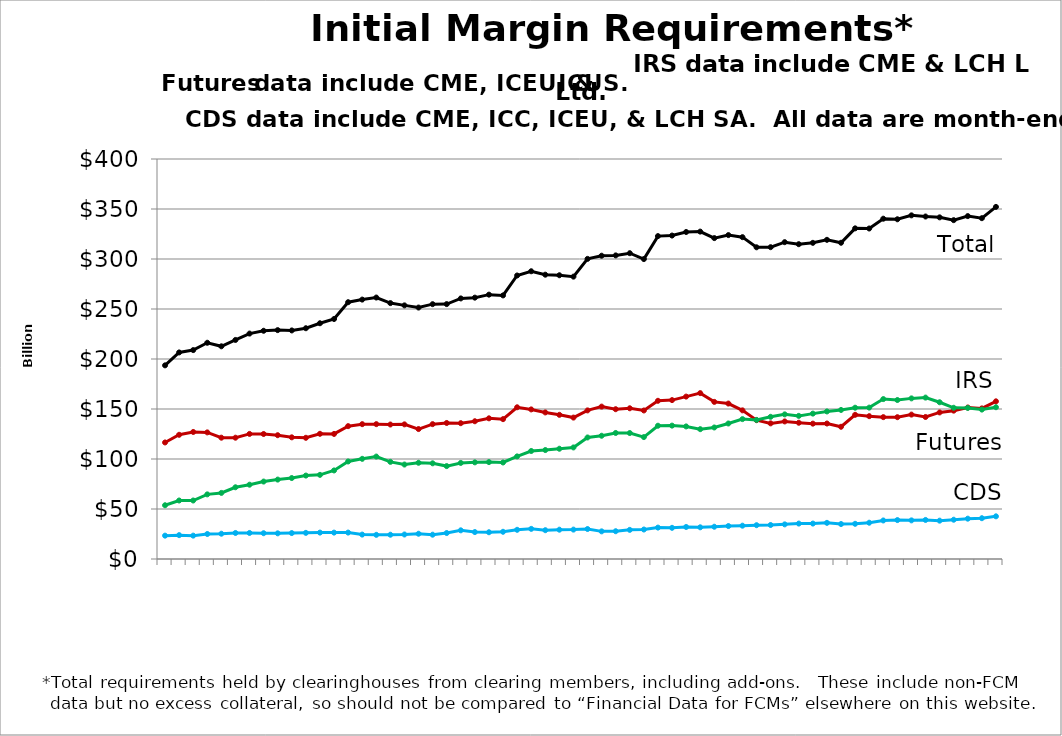
| Category | CDS | Futures | IRS | Total |
|---|---|---|---|---|
| nan |  |  |  |  |
| 2014-01-31 |  |  |  |  |
| nan |  |  |  |  |
| 2014-03-31 |  |  |  |  |
| nan |  |  |  |  |
| 2014-05-30 |  |  |  |  |
| nan |  |  |  |  |
| 2014-07-31 |  |  |  |  |
| nan |  |  |  |  |
| 2014-09-30 |  |  |  |  |
| nan |  |  |  |  |
| 2014-11-28 |  |  |  |  |
| nan |  |  |  |  |
| 2015-01-30 |  |  |  |  |
| nan |  |  |  |  |
| 2015-03-31 |  |  |  |  |
| nan |  |  |  |  |
| 2015-05-29 |  |  |  |  |
| nan |  |  |  |  |
| 2015-07-31 |  |  |  |  |
| nan |  |  |  |  |
| 2015-09-30 |  |  |  |  |
| nan |  |  |  |  |
| 2015-11-30 |  |  |  |  |
| nan |  |  |  |  |
| 2016-01-29 |  |  |  |  |
| nan |  |  |  |  |
| 2016-03-31 |  |  |  |  |
| nan |  |  |  |  |
| 2016-05-31 |  |  |  |  |
| nan |  |  |  |  |
| 2016-07-29 |  |  |  |  |
| nan |  |  |  |  |
| 2016-09-30 |  |  |  |  |
| nan |  |  |  |  |
| 2016-11-30 |  |  |  |  |
| nan |  |  |  |  |
| 2017-01-31 |  |  |  |  |
| nan |  |  |  |  |
| 2017-03-31 |  |  |  |  |
| nan |  |  |  |  |
| 2017-05-31 |  |  |  |  |
| nan |  |  |  |  |
| 2017-07-31 |  |  |  |  |
| nan |  |  |  |  |
| 2017-09-29 |  |  |  |  |
| nan |  |  |  |  |
| 2017-11-30 |  |  |  |  |
| nan |  |  |  |  |
| 2018-01-31 |  |  |  |  |
| nan |  |  |  |  |
| 2018-03-29 |  |  |  |  |
| nan |  |  |  |  |
| 2018-05-31 |  |  |  |  |
| nan |  |  |  |  |
| 2018-07-31 |  |  |  |  |
| nan |  |  |  |  |
| 2018-09-28 |  |  |  |  |
| nan |  |  |  |  |
| 2018-11-30 |  |  |  |  |